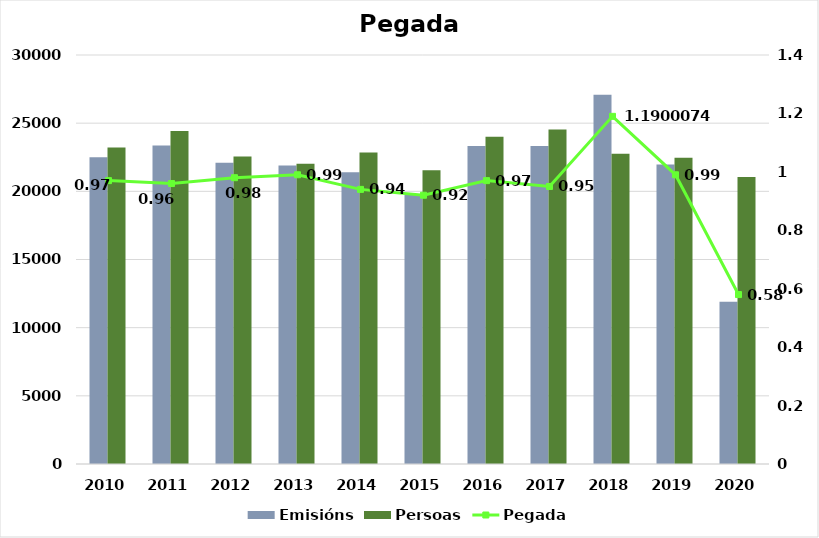
| Category | Emisións | Persoas |
|---|---|---|
| 2010.0 | 22496 | 23219 |
| 2011.0 | 23371 | 24429 |
| 2012.0 | 22096 | 22564 |
| 2013.0 | 21886 | 22026 |
| 2014.0 | 21397 | 22848 |
| 2015.0 | 19749 | 21549 |
| 2016.0 | 23330 | 24001 |
| 2017.0 | 23332 | 24529 |
| 2018.0 | 27081 | 22757 |
| 2019.0 | 21976 | 22467 |
| 2020.0 | 11903 | 21048 |